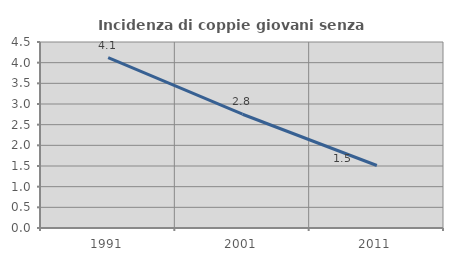
| Category | Incidenza di coppie giovani senza figli |
|---|---|
| 1991.0 | 4.121 |
| 2001.0 | 2.752 |
| 2011.0 | 1.512 |